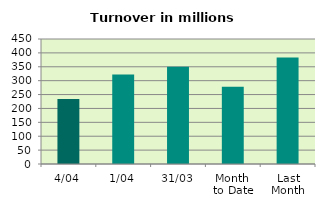
| Category | Series 0 |
|---|---|
| 4/04 | 234.409 |
| 1/04 | 322.085 |
| 31/03 | 349.81 |
| Month 
to Date | 278.247 |
| Last
Month | 383.695 |